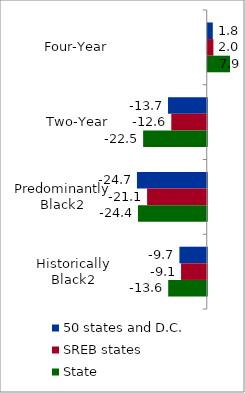
| Category | 50 states and D.C. | SREB states | State |
|---|---|---|---|
| Four-Year | 1.785 | 1.992 | 7.887 |
| Two-Year | -13.708 | -12.552 | -22.521 |
| Predominantly Black2 | -24.704 | -21.117 | -24.353 |
| Historically Black2 | -9.68 | -9.097 | -13.642 |